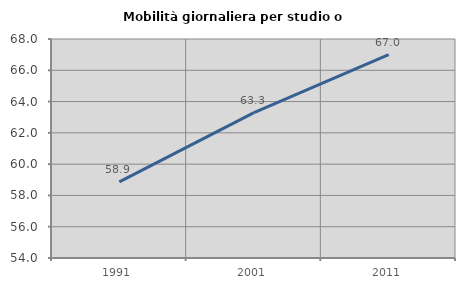
| Category | Mobilità giornaliera per studio o lavoro |
|---|---|
| 1991.0 | 58.864 |
| 2001.0 | 63.29 |
| 2011.0 | 67.002 |